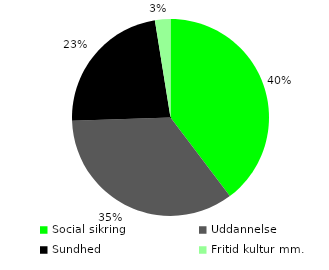
| Category | Sektor |
|---|---|
| Social sikring | 0.397 |
| Uddannelse | 0.348 |
| Sundhed | 0.23 |
| Fritid kultur mm. | 0.025 |